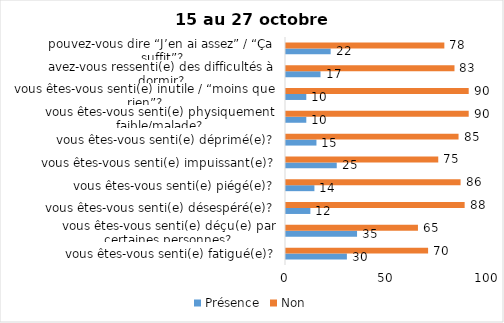
| Category | Présence | Non |
|---|---|---|
| vous êtes-vous senti(e) fatigué(e)? | 30 | 70 |
| vous êtes-vous senti(e) déçu(e) par certaines personnes? | 35 | 65 |
| vous êtes-vous senti(e) désespéré(e)? | 12 | 88 |
| vous êtes-vous senti(e) piégé(e)? | 14 | 86 |
| vous êtes-vous senti(e) impuissant(e)? | 25 | 75 |
| vous êtes-vous senti(e) déprimé(e)? | 15 | 85 |
| vous êtes-vous senti(e) physiquement faible/malade? | 10 | 90 |
| vous êtes-vous senti(e) inutile / “moins que rien”? | 10 | 90 |
| avez-vous ressenti(e) des difficultés à dormir? | 17 | 83 |
| pouvez-vous dire “J’en ai assez” / “Ça suffit”? | 22 | 78 |